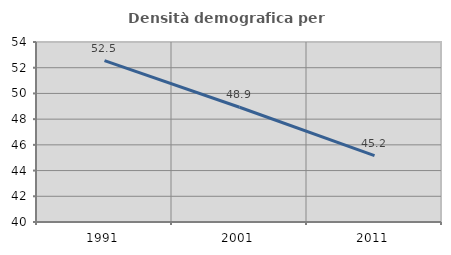
| Category | Densità demografica |
|---|---|
| 1991.0 | 52.546 |
| 2001.0 | 48.923 |
| 2011.0 | 45.165 |